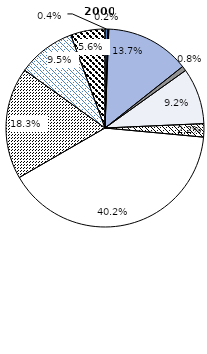
| Category | 2000 |
|---|---|
| Huile/graisse/cire animale/végétale | 0.448 |
| Boissons et tabac | 0.166 |
| Produits chimiques | 13.723 |
| Produits de base | 0.791 |
| Matières premières (hors alimentation et carburants) | 9.167 |
| Alimentation et bétail | 2.177 |
| Machineries et équipements de transport | 40.19 |
| Produits manufacturés | 18.263 |
| Carburants minéraux et lubrifiants | 9.467 |
| Articles manufacturés divers | 5.608 |